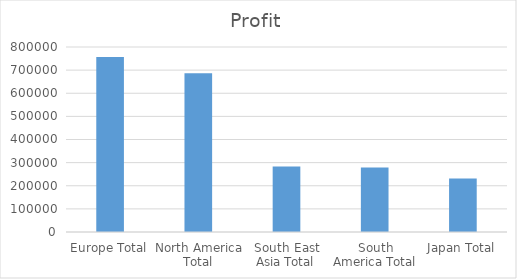
| Category | Profit |
|---|---|
| Europe Total | 756947.88 |
| North America Total | 686019.92 |
| South East Asia Total | 283698.64 |
| South America Total | 278705.8 |
| Japan Total | 230816.2 |